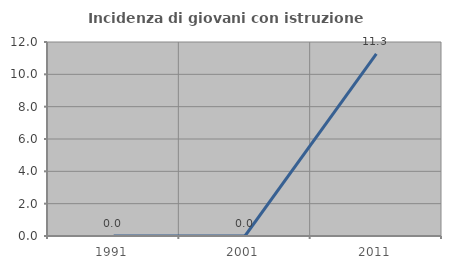
| Category | Incidenza di giovani con istruzione universitaria |
|---|---|
| 1991.0 | 0 |
| 2001.0 | 0 |
| 2011.0 | 11.268 |